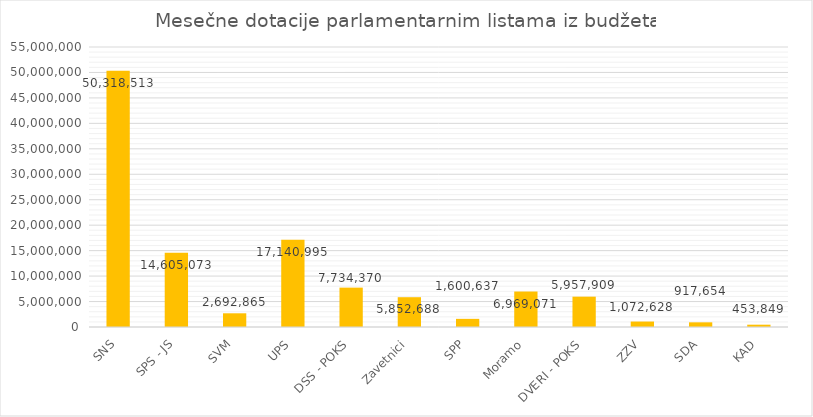
| Category | Series 3 |
|---|---|
| SNS | 50318513.2 |
| SPS - JS | 14605072.518 |
| SVM | 2692864.982 |
| UPS | 17140995.021 |
| DSS - POKS | 7734370.07 |
| Zavetnici | 5852687.894 |
| SPP | 1600636.838 |
| Moramo | 6969070.697 |
| DVERI - POKS | 5957908.744 |
| ZZV | 1072627.598 |
| SDA | 917653.806 |
| KAD | 453848.632 |